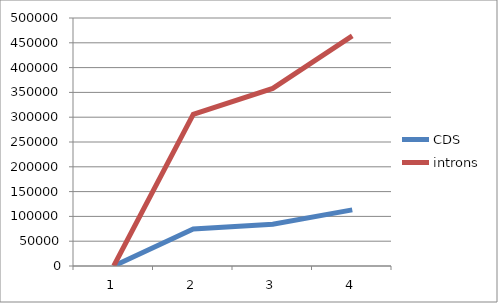
| Category | CDS | introns |
|---|---|---|
| 0 | 0 | 0 |
| 1 | 74656 | 305896 |
| 2 | 84110 | 358001 |
| 3 | 113178 | 463844 |